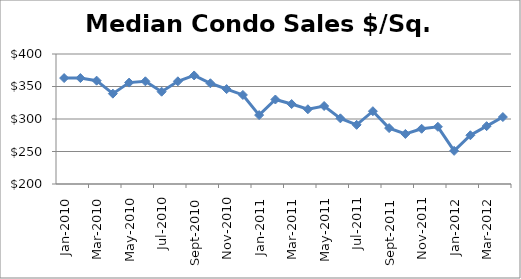
| Category | Series 0 |
|---|---|
| 2010-01-01 | 363 |
| 2010-02-01 | 363 |
| 2010-03-01 | 359 |
| 2010-04-01 | 339 |
| 2010-05-01 | 356 |
| 2010-06-01 | 358 |
| 2010-07-01 | 342 |
| 2010-08-01 | 358 |
| 2010-09-01 | 367 |
| 2010-10-01 | 355 |
| 2010-11-01 | 346 |
| 2010-12-01 | 337 |
| 2011-01-01 | 306 |
| 2011-02-01 | 330 |
| 2011-03-01 | 323 |
| 2011-04-01 | 315 |
| 2011-05-01 | 320 |
| 2011-06-01 | 301 |
| 2011-07-01 | 291 |
| 2011-08-01 | 312 |
| 2011-09-01 | 286 |
| 2011-10-01 | 277 |
| 2011-11-01 | 285 |
| 2011-12-01 | 288 |
| 2012-01-01 | 251 |
| 2012-02-01 | 275 |
| 2012-03-01 | 289 |
| 2012-04-01 | 303 |